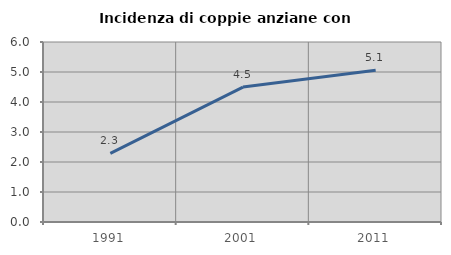
| Category | Incidenza di coppie anziane con figli |
|---|---|
| 1991.0 | 2.29 |
| 2001.0 | 4.497 |
| 2011.0 | 5.061 |